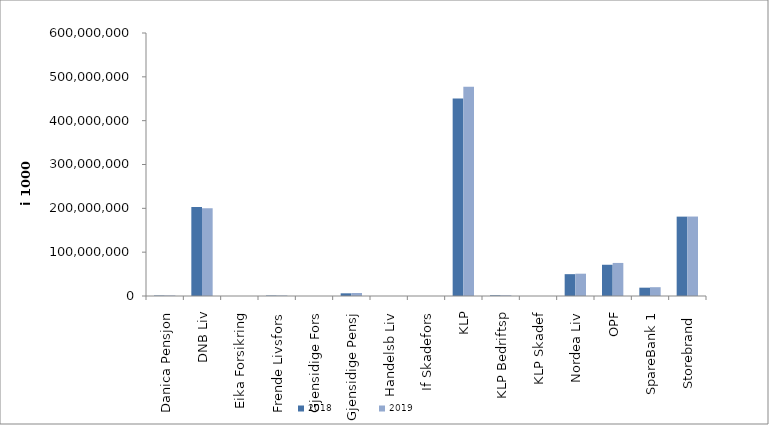
| Category | 2018 | 2019 |
|---|---|---|
| Danica Pensjon | 1056297.566 | 1186547.58 |
| DNB Liv | 203084238.5 | 200343540.272 |
| Eika Forsikring | 0 | 0 |
| Frende Livsfors | 1014744 | 1154102.79 |
| Gjensidige Fors | 0 | 0 |
| Gjensidige Pensj | 6138522 | 6798454 |
| Handelsb Liv | 23193 | 24156.062 |
| If Skadefors | 0 | 0 |
| KLP | 450711574.444 | 477264053.304 |
| KLP Bedriftsp | 1517090 | 1573553 |
| KLP Skadef | 12214.148 | 23088 |
| Nordea Liv | 49831728.59 | 50874402.353 |
| OPF | 71272663 | 75420758.386 |
| SpareBank 1 | 18998939.186 | 20077494.383 |
| Storebrand  | 181070508.746 | 181276652.008 |